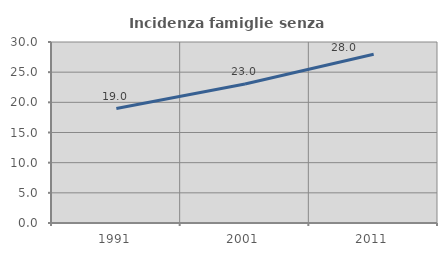
| Category | Incidenza famiglie senza nuclei |
|---|---|
| 1991.0 | 18.962 |
| 2001.0 | 23.032 |
| 2011.0 | 27.956 |